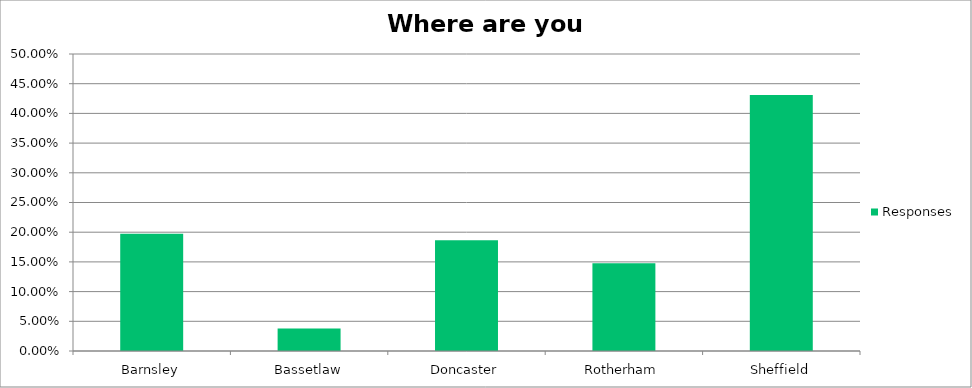
| Category | Responses |
|---|---|
| Barnsley | 0.197 |
| Bassetlaw | 0.038 |
| Doncaster | 0.186 |
| Rotherham | 0.148 |
| Sheffield | 0.431 |